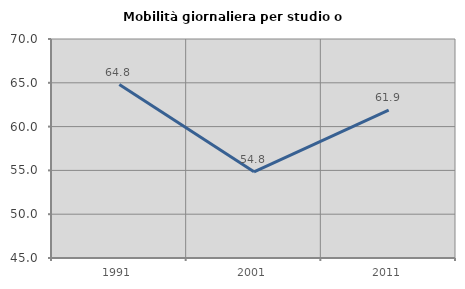
| Category | Mobilità giornaliera per studio o lavoro |
|---|---|
| 1991.0 | 64.798 |
| 2001.0 | 54.844 |
| 2011.0 | 61.869 |